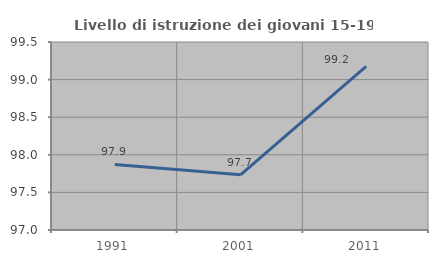
| Category | Livello di istruzione dei giovani 15-19 anni |
|---|---|
| 1991.0 | 97.872 |
| 2001.0 | 97.734 |
| 2011.0 | 99.175 |